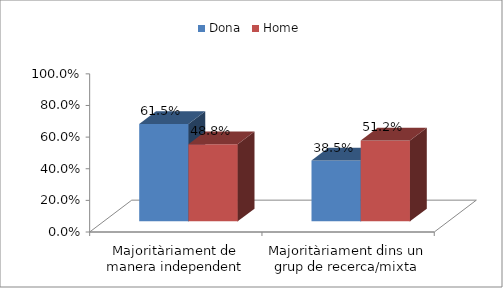
| Category | Dona | Home |
|---|---|---|
| Majoritàriament de manera independent | 0.615 | 0.488 |
| Majoritàriament dins un grup de recerca/mixta | 0.385 | 0.512 |